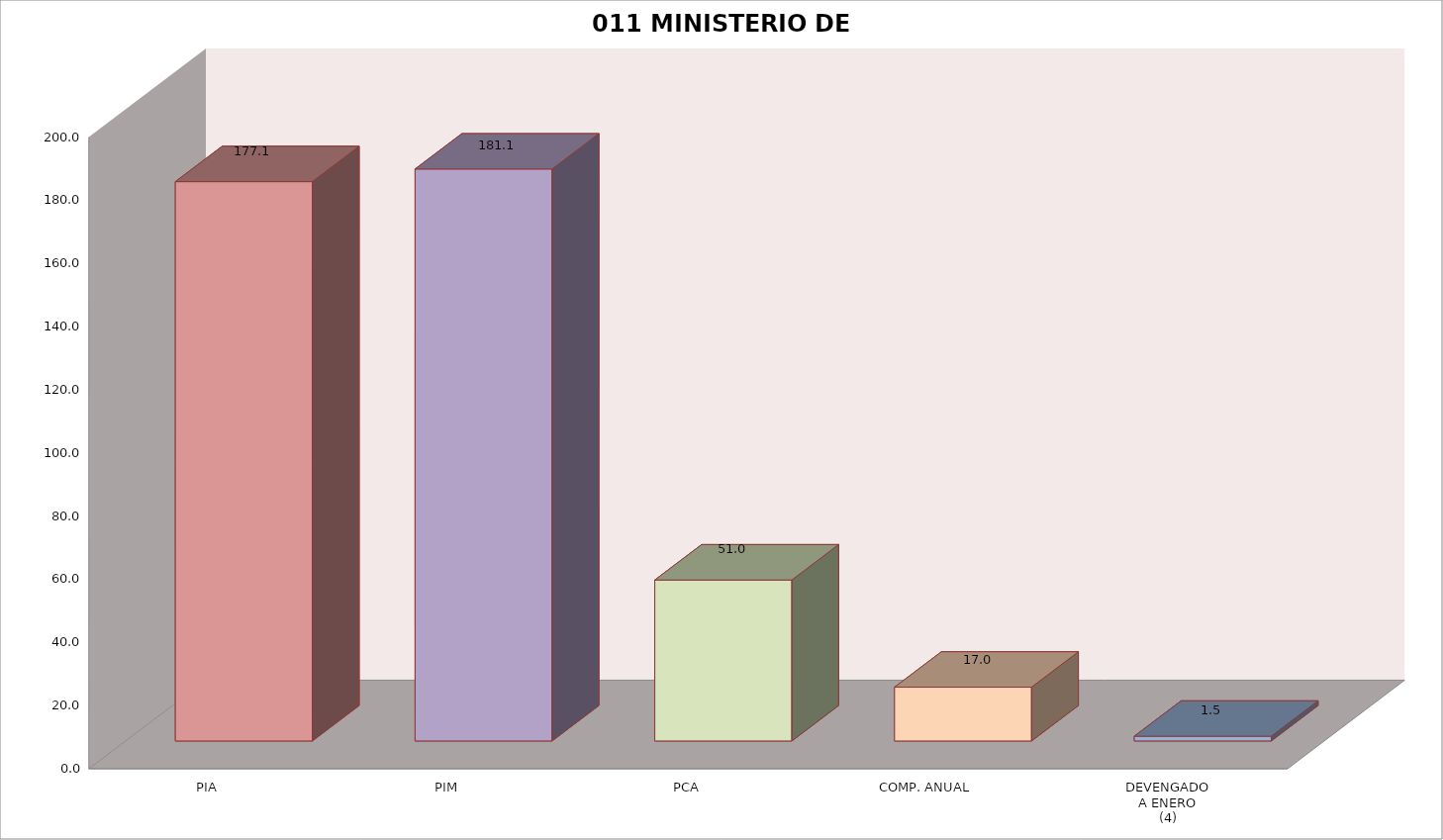
| Category | 011 MINISTERIO DE SALUD |
|---|---|
| PIA | 177.09 |
| PIM | 181.09 |
| PCA | 50.971 |
| COMP. ANUAL | 17.031 |
| DEVENGADO
A ENERO
(4) | 1.502 |